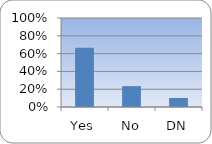
| Category | Series 0 |
|---|---|
| Yes | 0.664 |
| No | 0.234 |
| DN | 0.101 |